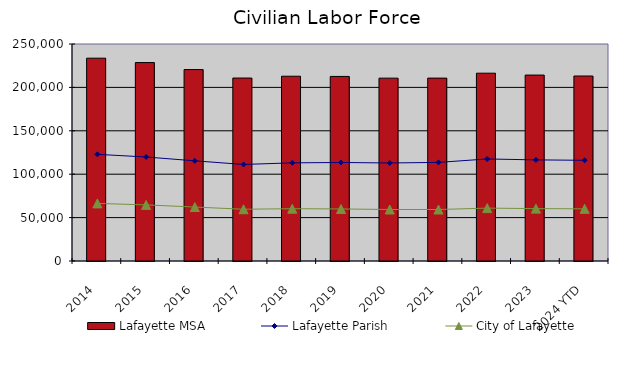
| Category | Lafayette MSA |
|---|---|
| 2014 | 233661.833 |
| 2015 | 228597.667 |
| 2016 | 220529.167 |
| 2017 | 210780.417 |
| 2018 | 212876.5 |
| 2019 | 212632.667 |
| 2020 | 210660.333 |
| 2021 | 210685.5 |
| 2022 | 216361.083 |
| 2023 | 214198 |
| 2024 YTD | 213121.333 |